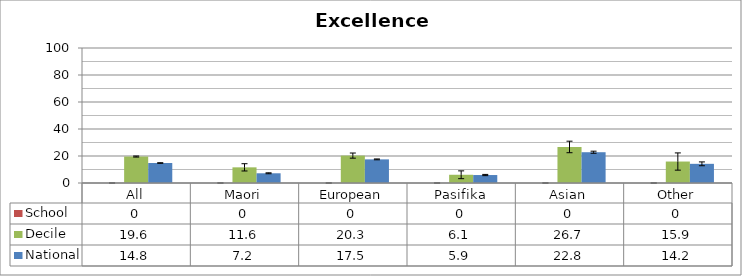
| Category | School | Decile | National |
|---|---|---|---|
| All | 0 | 19.6 | 14.8 |
| Maori | 0 | 11.6 | 7.2 |
| European | 0 | 20.3 | 17.5 |
| Pasifika | 0 | 6.1 | 5.9 |
| Asian | 0 | 26.7 | 22.8 |
| Other | 0 | 15.9 | 14.2 |